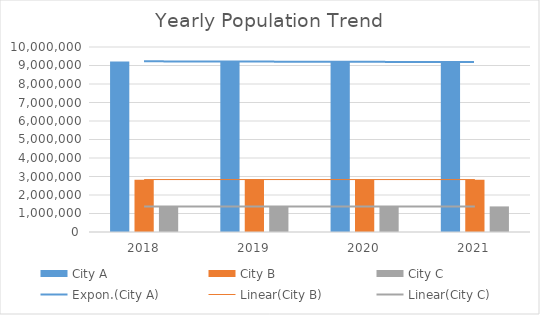
| Category | City A | City B | City C |
|---|---|---|---|
| 2018.0 | 9218653 | 2826498 | 1382753 |
| 2019.0 | 9216034 | 2845680 | 1384850 |
| 2020.0 | 9210055 | 2836450 | 1385890 |
| 2021.0 | 9175850 | 2828890 | 1383320 |